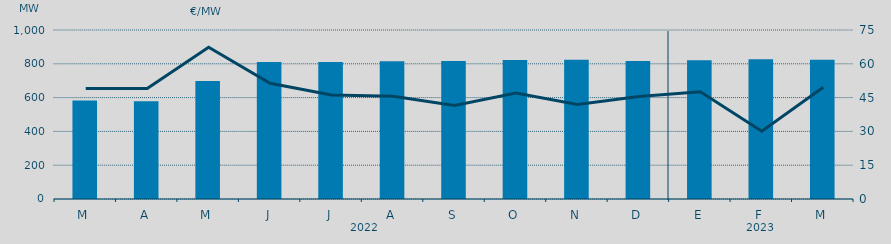
| Category | Potencia media a subir |
|---|---|
| M | 582.265 |
| A | 578.1 |
| M | 697.8 |
| J | 810.166 |
| J | 810.419 |
| A | 815.058 |
| S | 816.21 |
| O | 822.826 |
| N | 823.957 |
| D | 816.374 |
| E | 820.977 |
| F | 826.222 |
| M | 823.778 |